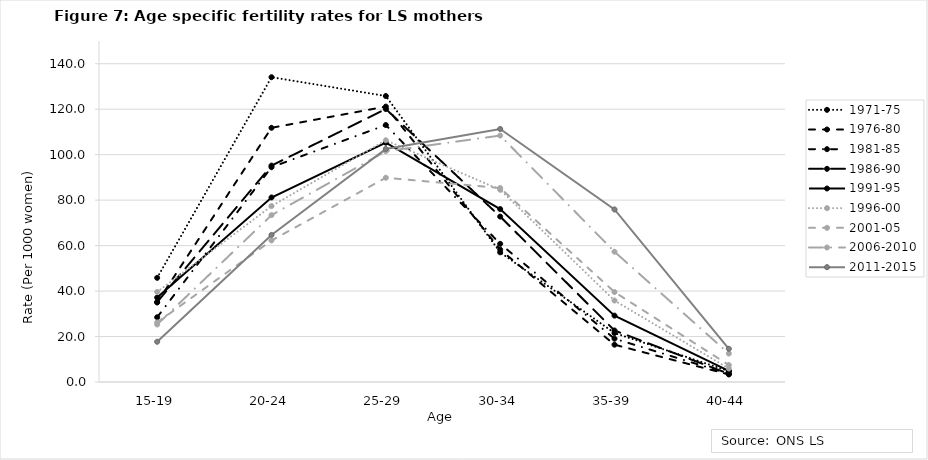
| Category | 1971-75 | 1976-80 | 1981-85 | 1986-90 | 1991-95 | 1996-00 | 2001-05 | 2006-2010 | 2011-2015 |
|---|---|---|---|---|---|---|---|---|---|
| 15-19 | 45.82 | 34.97 | 28.48 | 35.19 | 37.15 | 39.62 | 26.2 | 25.3 | 17.7 |
| 20-24 | 134.08 | 111.82 | 94.48 | 95.2 | 81.17 | 77.39 | 62.25 | 73.4 | 64.7 |
| 25-29 | 125.8 | 121.15 | 113.04 | 120.08 | 105.28 | 106.34 | 89.85 | 101.5 | 102.5 |
| 30-34 | 57.04 | 58.24 | 60.77 | 72.77 | 76.07 | 84.56 | 85.34 | 108.4 | 111.3 |
| 35-39 | 21.54 | 16.41 | 19.06 | 22.66 | 29.2 | 35.83 | 39.58 | 57.3 | 75.9 |
| 40-44 | 4.81 | 3.31 | 3.59 | 3.61 | 4.86 | 5.92 | 7.45 | 12.5 | 14.6 |